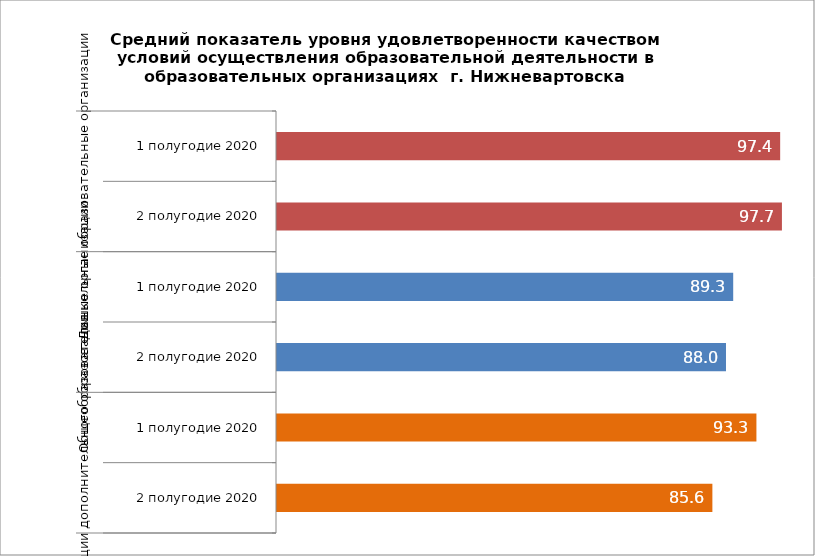
| Category | Series 0 |
|---|---|
| 0 | 97.422 |
| 1 | 97.729 |
| 2 | 89.263 |
| 3 | 88.01 |
| 4 | 93.297 |
| 5 | 85.645 |